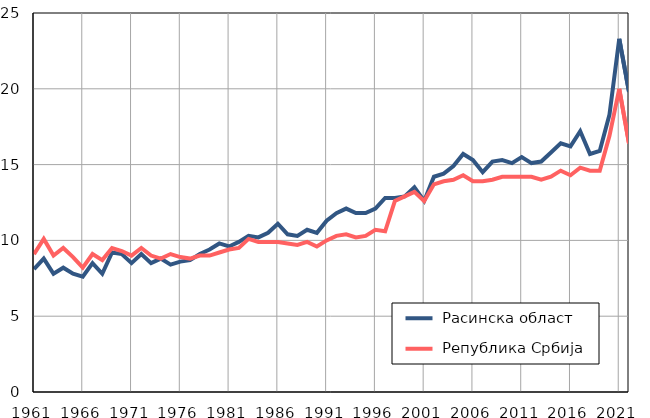
| Category |  Расинска област |  Република Србија |
|---|---|---|
| 1961.0 | 8.1 | 9.1 |
| 1962.0 | 8.8 | 10.1 |
| 1963.0 | 7.8 | 9 |
| 1964.0 | 8.2 | 9.5 |
| 1965.0 | 7.8 | 8.9 |
| 1966.0 | 7.6 | 8.2 |
| 1967.0 | 8.5 | 9.1 |
| 1968.0 | 7.8 | 8.7 |
| 1969.0 | 9.2 | 9.5 |
| 1970.0 | 9.1 | 9.3 |
| 1971.0 | 8.5 | 9 |
| 1972.0 | 9.1 | 9.5 |
| 1973.0 | 8.5 | 9 |
| 1974.0 | 8.8 | 8.8 |
| 1975.0 | 8.4 | 9.1 |
| 1976.0 | 8.6 | 8.9 |
| 1977.0 | 8.7 | 8.8 |
| 1978.0 | 9.1 | 9 |
| 1979.0 | 9.4 | 9 |
| 1980.0 | 9.8 | 9.2 |
| 1981.0 | 9.6 | 9.4 |
| 1982.0 | 9.9 | 9.5 |
| 1983.0 | 10.3 | 10.1 |
| 1984.0 | 10.2 | 9.9 |
| 1985.0 | 10.5 | 9.9 |
| 1986.0 | 11.1 | 9.9 |
| 1987.0 | 10.4 | 9.8 |
| 1988.0 | 10.3 | 9.7 |
| 1989.0 | 10.7 | 9.9 |
| 1990.0 | 10.5 | 9.6 |
| 1991.0 | 11.3 | 10 |
| 1992.0 | 11.8 | 10.3 |
| 1993.0 | 12.1 | 10.4 |
| 1994.0 | 11.8 | 10.2 |
| 1995.0 | 11.8 | 10.3 |
| 1996.0 | 12.1 | 10.7 |
| 1997.0 | 12.8 | 10.6 |
| 1998.0 | 12.8 | 12.6 |
| 1999.0 | 12.9 | 12.9 |
| 2000.0 | 13.5 | 13.2 |
| 2001.0 | 12.6 | 12.6 |
| 2002.0 | 14.2 | 13.7 |
| 2003.0 | 14.4 | 13.9 |
| 2004.0 | 14.9 | 14 |
| 2005.0 | 15.7 | 14.3 |
| 2006.0 | 15.3 | 13.9 |
| 2007.0 | 14.5 | 13.9 |
| 2008.0 | 15.2 | 14 |
| 2009.0 | 15.3 | 14.2 |
| 2010.0 | 15.1 | 14.2 |
| 2011.0 | 15.5 | 14.2 |
| 2012.0 | 15.1 | 14.2 |
| 2013.0 | 15.2 | 14 |
| 2014.0 | 15.8 | 14.2 |
| 2015.0 | 16.4 | 14.6 |
| 2016.0 | 16.2 | 14.3 |
| 2017.0 | 17.2 | 14.8 |
| 2018.0 | 15.7 | 14.6 |
| 2019.0 | 15.9 | 14.6 |
| 2020.0 | 18.3 | 16.9 |
| 2021.0 | 23.3 | 20 |
| 2022.0 | 19.8 | 16.4 |